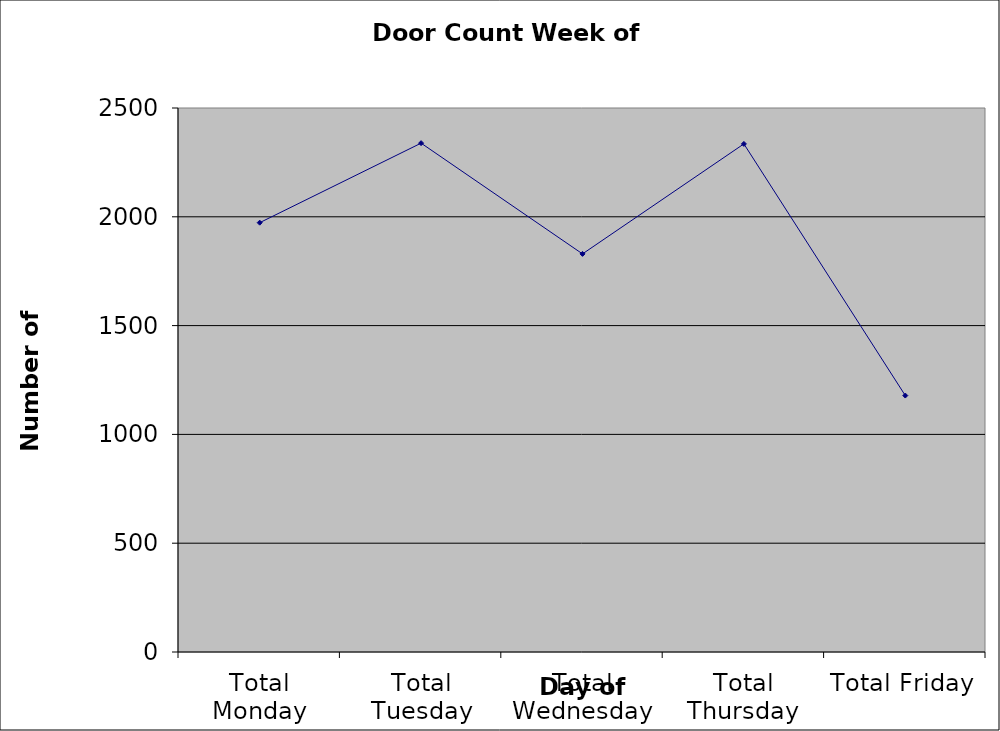
| Category | Series 0 |
|---|---|
| Total Monday | 1973 |
| Total Tuesday | 2338.5 |
| Total Wednesday | 1829.5 |
| Total Thursday | 2335 |
| Total Friday | 1178.5 |